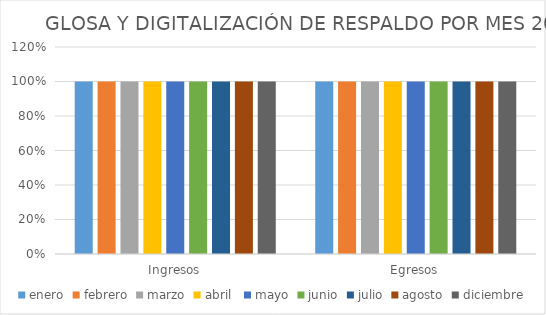
| Category | enero | febrero | marzo | abril  | mayo | junio | julio | agosto | diciembre |
|---|---|---|---|---|---|---|---|---|---|
| Ingresos | 1 | 1 | 1 | 1 | 1 | 1 | 1 | 1 | 1 |
| Egresos | 1 | 1 | 1 | 1 | 1 | 1 | 1 | 1 | 1 |